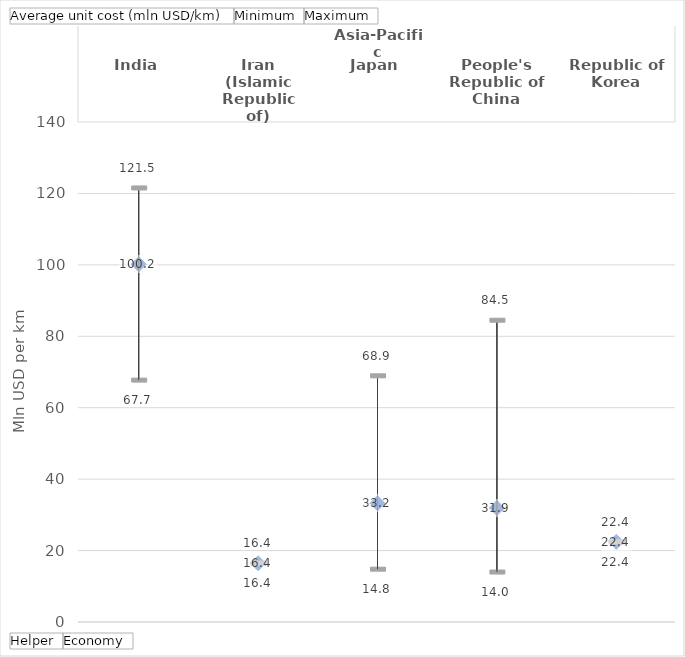
| Category | Average unit cost (mln USD/km) | Minimum | Maximum |
|---|---|---|---|
| 0 | 100.161 | 67.729 | 121.533 |
| 1 | 16.449 | 16.449 | 16.449 |
| 2 | 33.233 | 14.793 | 68.929 |
| 3 | 31.918 | 13.991 | 84.498 |
| 4 | 22.437 | 22.437 | 22.437 |